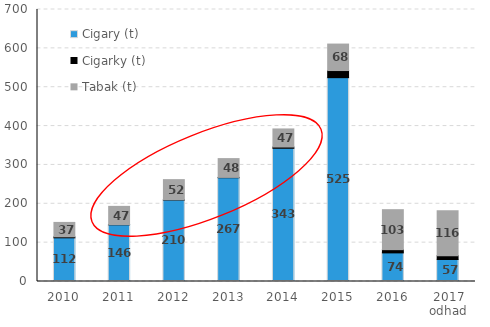
| Category | Cigary (t) | Cigarky (t) | Tabak (t) |
|---|---|---|---|
| 2010 | 112.419 | 2.564 | 37.083 |
| 2011 | 145.866 | 0.516 | 46.929 |
| 2012 | 209.654 | 0.777 | 51.738 |
| 2013 | 267.057 | 0.773 | 48.443 |
| 2014 | 342.833 | 3.263 | 46.531 |
| 2015 | 524.573 | 18.333 | 68.15 |
| 2016 | 73.642 | 8.296 | 102.899 |
| 2017 odhad | 56.581 | 9.84 | 115.867 |